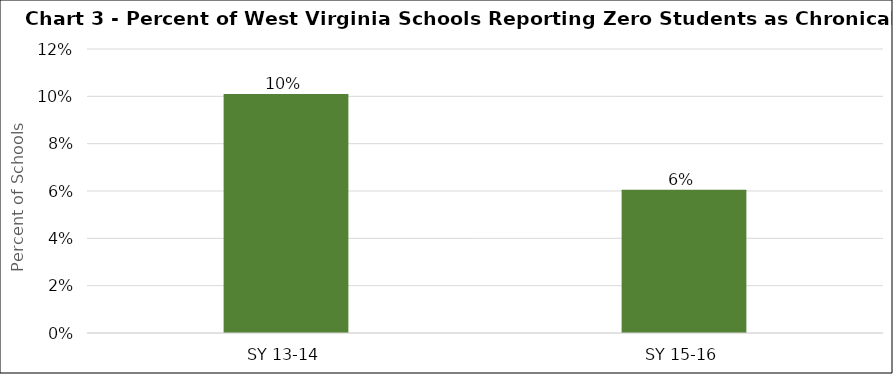
| Category | Series 0 |
|---|---|
| SY 13-14 | 0.101 |
| SY 15-16 | 0.061 |